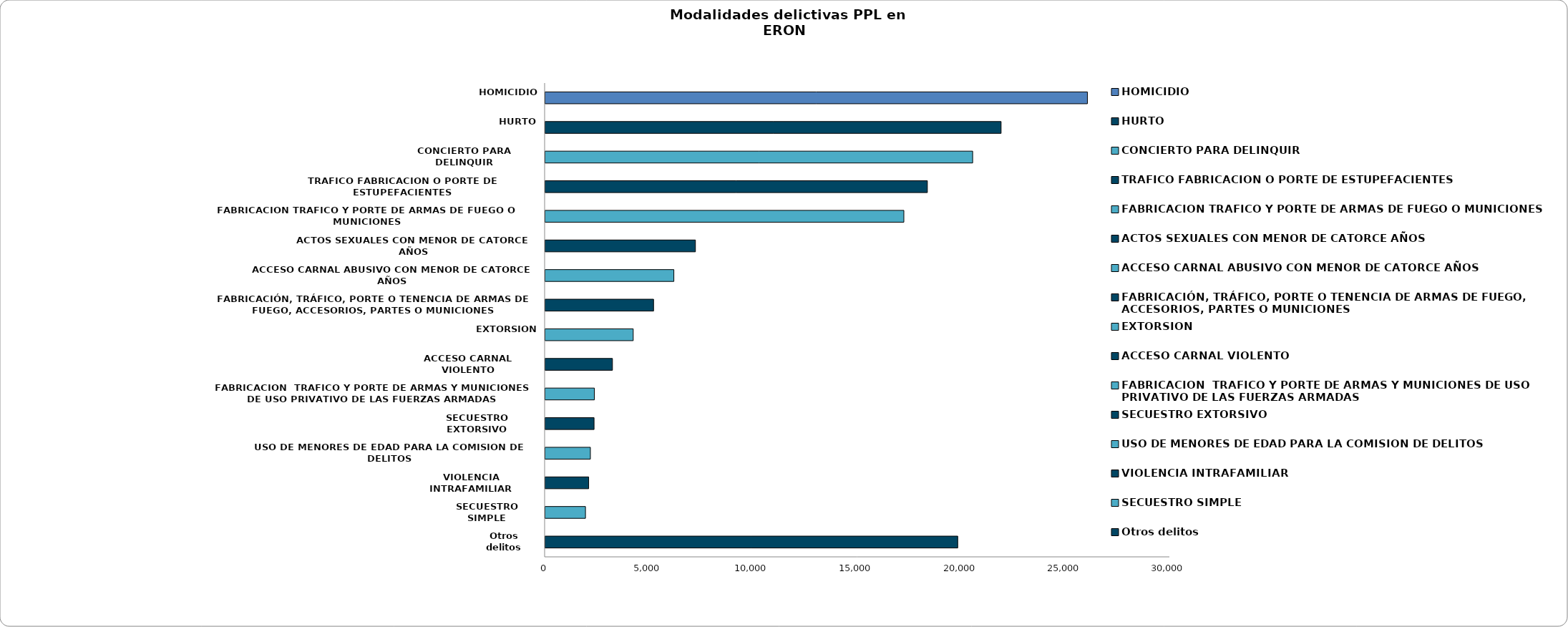
| Category | Series 0 |
|---|---|
| HOMICIDIO | 26030 |
| HURTO | 21885 |
| CONCIERTO PARA DELINQUIR | 20520 |
| TRAFICO FABRICACION O PORTE DE ESTUPEFACIENTES | 18345 |
| FABRICACION TRAFICO Y PORTE DE ARMAS DE FUEGO O MUNICIONES | 17216 |
| ACTOS SEXUALES CON MENOR DE CATORCE AÑOS | 7207 |
| ACCESO CARNAL ABUSIVO CON MENOR DE CATORCE AÑOS | 6172 |
| FABRICACIÓN, TRÁFICO, PORTE O TENENCIA DE ARMAS DE FUEGO, ACCESORIOS, PARTES O MUNICIONES | 5198 |
| EXTORSION | 4220 |
| ACCESO CARNAL VIOLENTO | 3223 |
| FABRICACION  TRAFICO Y PORTE DE ARMAS Y MUNICIONES DE USO PRIVATIVO DE LAS FUERZAS ARMADAS | 2354 |
| SECUESTRO EXTORSIVO | 2340 |
| USO DE MENORES DE EDAD PARA LA COMISION DE DELITOS | 2164 |
| VIOLENCIA INTRAFAMILIAR | 2081 |
| SECUESTRO SIMPLE | 1928 |
| Otros delitos | 19803 |